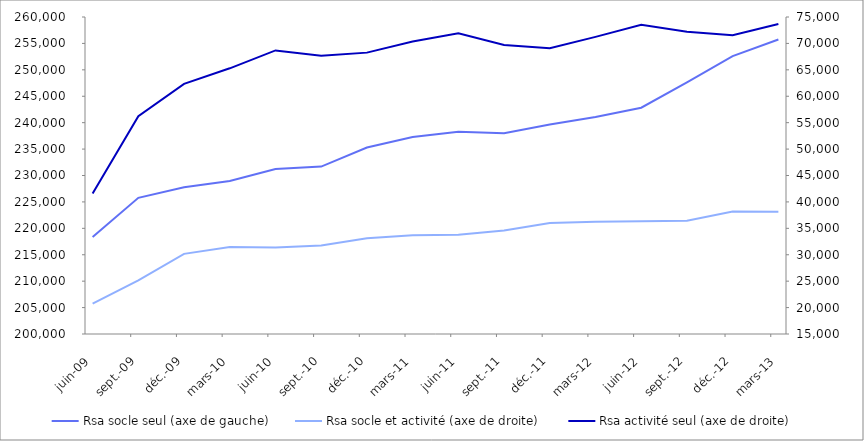
| Category | Rsa socle seul (axe de gauche) |
|---|---|
| 2009-06-01 | 218378 |
| 2009-09-01 | 225769 |
| 2009-12-01 | 227761 |
| 2010-03-01 | 228967 |
| 2010-06-01 | 231244 |
| 2010-09-01 | 231685 |
| 2010-12-01 | 235298 |
| 2011-03-01 | 237282 |
| 2011-06-01 | 238295 |
| 2011-09-01 | 238005 |
| 2011-12-01 | 239648 |
| 2012-03-01 | 241061 |
| 2012-06-01 | 242829 |
| 2012-09-01 | 247613 |
| 2012-12-01 | 252591 |
| 2013-03-31 | 255750 |